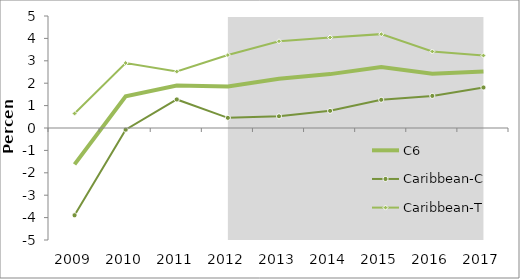
| Category | C6 | Caribbean-C | Caribbean-T |
|---|---|---|---|
| 2009.0 | -1.623 | -3.894 | 0.647 |
| 2010.0 | 1.413 | -0.075 | 2.901 |
| 2011.0 | 1.897 | 1.274 | 2.52 |
| 2012.0 | 1.855 | 0.454 | 3.256 |
| 2013.0 | 2.198 | 0.522 | 3.875 |
| 2014.0 | 2.406 | 0.767 | 4.045 |
| 2015.0 | 2.725 | 1.26 | 4.191 |
| 2016.0 | 2.424 | 1.433 | 3.415 |
| 2017.0 | 2.522 | 1.808 | 3.235 |